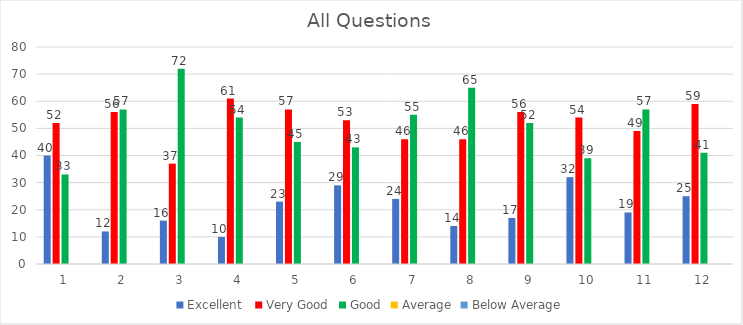
| Category | Excellent  | Very Good | Good | Average | Below Average |
|---|---|---|---|---|---|
| 0 | 40 | 52 | 33 | 0 | 0 |
| 1 | 12 | 56 | 57 | 0 | 0 |
| 2 | 16 | 37 | 72 | 0 | 0 |
| 3 | 10 | 61 | 54 | 0 | 0 |
| 4 | 23 | 57 | 45 | 0 | 0 |
| 5 | 29 | 53 | 43 | 0 | 0 |
| 6 | 24 | 46 | 55 | 0 | 0 |
| 7 | 14 | 46 | 65 | 0 | 0 |
| 8 | 17 | 56 | 52 | 0 | 0 |
| 9 | 32 | 54 | 39 | 0 | 0 |
| 10 | 19 | 49 | 57 | 0 | 0 |
| 11 | 25 | 59 | 41 | 0 | 0 |